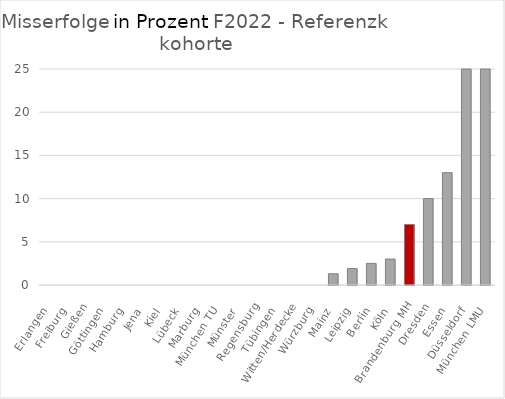
| Category | Misserfolg Ref |
|---|---|
| Erlangen | 0 |
| Freiburg | 0 |
| Gießen | 0 |
| Göttingen | 0 |
| Hamburg | 0 |
| Jena | 0 |
| Kiel | 0 |
| Lübeck | 0 |
| Marburg | 0 |
| München TU | 0 |
| Münster | 0 |
| Regensburg | 0 |
| Tübingen | 0 |
| Witten/Herdecke | 0 |
| Würzburg | 0 |
| Mainz | 1.3 |
| Leipzig | 1.9 |
| Berlin | 2.5 |
| Köln | 3 |
| Brandenburg MH | 7 |
| Dresden | 10 |
| Essen | 13 |
| Düsseldorf | 25 |
| München LMU | 37.5 |